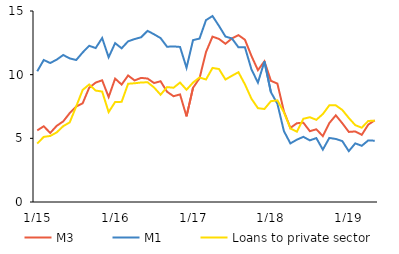
| Category | M3 | M1 | Loans to private sector |
|---|---|---|---|
|  1/15 | 5.622 | 10.265 | 4.593 |
| 2 | 5.948 | 11.151 | 5.114 |
| 3 | 5.423 | 10.914 | 5.186 |
| 4 | 5.983 | 11.181 | 5.467 |
| 5 | 6.33 | 11.545 | 5.955 |
| 6 | 6.98 | 11.278 | 6.253 |
| 7 | 7.5 | 11.149 | 7.503 |
| 8 | 7.755 | 11.745 | 8.802 |
| 9 | 8.971 | 12.27 | 9.227 |
| 10 | 9.377 | 12.089 | 8.753 |
| 11 | 9.559 | 12.878 | 8.672 |
| 12 | 8.244 | 11.367 | 7.06 |
|  1/16 | 9.691 | 12.477 | 7.853 |
| 2 | 9.221 | 12.071 | 7.865 |
| 3 | 9.937 | 12.619 | 9.286 |
| 4 | 9.548 | 12.796 | 9.325 |
| 5 | 9.747 | 12.937 | 9.385 |
| 6 | 9.696 | 13.442 | 9.403 |
| 7 | 9.341 | 13.169 | 8.992 |
| 8 | 9.484 | 12.872 | 8.426 |
| 9 | 8.659 | 12.193 | 9.022 |
| 10 | 8.307 | 12.218 | 8.975 |
| 11 | 8.449 | 12.177 | 9.38 |
| 12 | 6.723 | 10.54 | 8.816 |
|  1/17 | 8.966 | 12.711 | 9.379 |
| 2 | 9.714 | 12.834 | 9.781 |
| 3 | 11.775 | 14.282 | 9.62 |
| 4 | 12.987 | 14.606 | 10.528 |
| 5 | 12.808 | 13.83 | 10.445 |
| 6 | 12.425 | 12.993 | 9.619 |
| 7 | 12.849 | 12.842 | 9.914 |
| 8 | 13.105 | 12.147 | 10.193 |
| 9 | 12.743 | 12.148 | 9.238 |
| 10 | 11.473 | 10.419 | 8.113 |
| 11 | 10.355 | 9.377 | 7.368 |
| 12 | 11.047 | 11.032 | 7.305 |
|  1/18 | 9.516 | 8.626 | 7.918 |
| 2 | 9.298 | 7.714 | 7.983 |
| 3 | 7.121 | 5.573 | 7.051 |
| 4 | 5.819 | 4.602 | 5.78 |
| 5 | 6.185 | 4.894 | 5.522 |
| 6 | 6.228 | 5.118 | 6.536 |
| 7 | 5.561 | 4.84 | 6.657 |
| 8 | 5.712 | 5.02 | 6.454 |
| 9 | 5.172 | 4.113 | 6.908 |
| 10 | 6.2 | 5.031 | 7.59 |
| 11 | 6.807 | 4.95 | 7.588 |
| 12 | 6.185 | 4.782 | 7.229 |
|  1/19 | 5.503 | 3.994 | 6.6 |
| 2 | 5.54 | 4.604 | 6.035 |
| 3 | 5.275 | 4.413 | 5.835 |
| 4 | 6.075 | 4.839 | 6.369 |
| 5 | 6.413 | 4.813 | 6.374 |